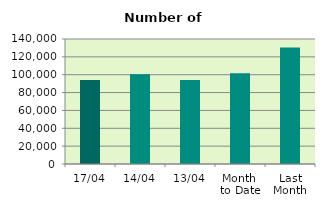
| Category | Series 0 |
|---|---|
| 17/04 | 94052 |
| 14/04 | 100536 |
| 13/04 | 94118 |
| Month 
to Date | 101736.667 |
| Last
Month | 130565.565 |